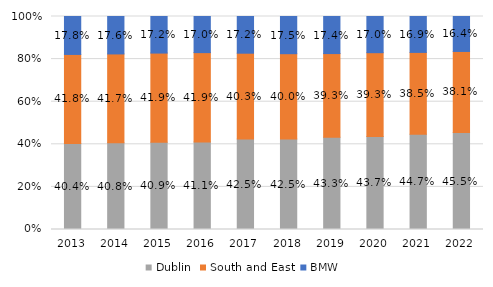
| Category | Dublin | South and East | BMW  |
|---|---|---|---|
| 2013 | 0.404 | 0.418 | 0.178 |
| 2014 | 0.408 | 0.417 | 0.176 |
| 2015 | 0.409 | 0.419 | 0.172 |
| 2016 | 0.411 | 0.419 | 0.17 |
| 2017 | 0.425 | 0.403 | 0.172 |
| 2018 | 0.425 | 0.4 | 0.175 |
| 2019 | 0.433 | 0.393 | 0.174 |
| 2020 | 0.437 | 0.393 | 0.17 |
| 2021 | 0.447 | 0.385 | 0.169 |
| 2022 | 0.455 | 0.381 | 0.164 |